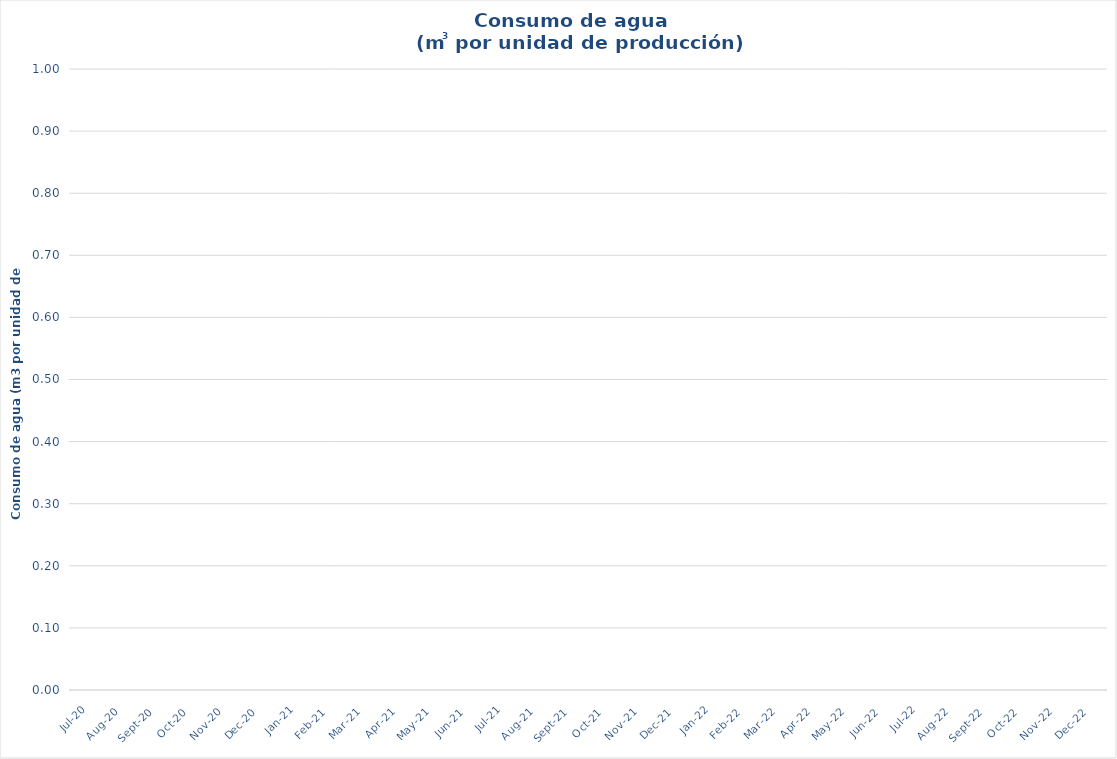
| Category | Series 0 |
|---|---|
| 2020-07-01 | 0 |
| 2020-08-01 | 0 |
| 2020-09-01 | 0 |
| 2020-10-01 | 0 |
| 2020-11-01 | 0 |
| 2020-12-01 | 0 |
| 2021-01-01 | 0 |
| 2021-02-01 | 0 |
| 2021-03-01 | 0 |
| 2021-04-01 | 0 |
| 2021-05-01 | 0 |
| 2021-06-01 | 0 |
| 2021-07-01 | 0 |
| 2021-08-01 | 0 |
| 2021-09-01 | 0 |
| 2021-10-01 | 0 |
| 2021-11-01 | 0 |
| 2021-12-01 | 0 |
| 2022-01-01 | 0 |
| 2022-02-01 | 0 |
| 2022-03-01 | 0 |
| 2022-04-01 | 0 |
| 2022-05-01 | 0 |
| 2022-06-01 | 0 |
| 2022-07-01 | 0 |
| 2022-08-01 | 0 |
| 2022-09-01 | 0 |
| 2022-10-01 | 0 |
| 2022-11-01 | 0 |
| 2022-12-01 | 0 |